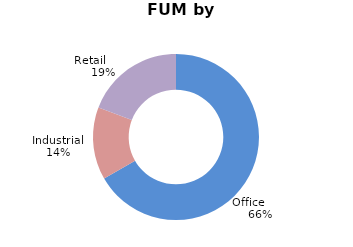
| Category | Series 0 |
|---|---|
| Office        | 0.66 |
| Industrial | 0.14 |
| Retail         | 0.19 |
| International | 0 |